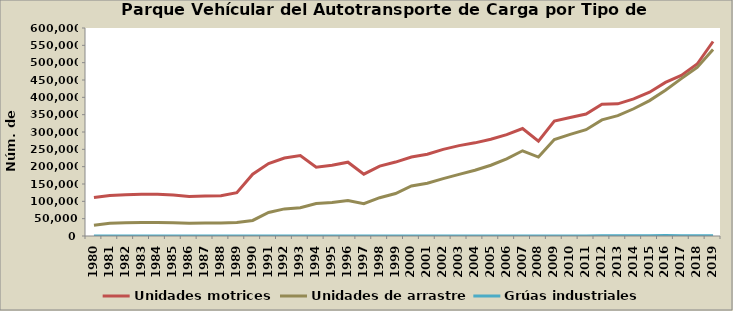
| Category | Unidades motrices | Unidades de arrastre | Grúas industriales |
|---|---|---|---|
| 1980.0 | 110810 | 31120 | 0 |
| 1981.0 | 117090 | 36760 | 0 |
| 1982.0 | 119309 | 38216 | 0 |
| 1983.0 | 120702 | 38639 | 0 |
| 1984.0 | 120702 | 38639 | 0 |
| 1985.0 | 117956 | 38317 | 0 |
| 1986.0 | 114000 | 36500 | 0 |
| 1987.0 | 115092 | 37245 | 0 |
| 1988.0 | 115897 | 37506 | 0 |
| 1989.0 | 124897 | 39113 | 0 |
| 1990.0 | 178130 | 44853 | 0 |
| 1991.0 | 209060 | 67865 | 0 |
| 1992.0 | 224913 | 78233 | 0 |
| 1993.0 | 232203 | 81307 | 0 |
| 1994.0 | 198273 | 93827 | 0 |
| 1995.0 | 204117 | 96638 | 0 |
| 1996.0 | 212909 | 102409 | 0 |
| 1997.0 | 178332 | 92999 | 0 |
| 1998.0 | 201587 | 110530 | 0 |
| 1999.0 | 213292 | 122619 | 126 |
| 2000.0 | 227847 | 144225 | 191 |
| 2001.0 | 235767 | 152341 | 212 |
| 2002.0 | 250025 | 165601 | 221 |
| 2003.0 | 260645 | 177864 | 251 |
| 2004.0 | 268725 | 189568 | 256 |
| 2005.0 | 279112 | 204186 | 266 |
| 2006.0 | 292418 | 222580 | 281 |
| 2007.0 | 310013 | 245843 | 294 |
| 2008.0 | 273455 | 227806 | 277 |
| 2009.0 | 331686 | 278133 | 329 |
| 2010.0 | 342064 | 293053 | 351 |
| 2011.0 | 351705 | 306700 | 355 |
| 2012.0 | 380342 | 334858 | 483 |
| 2013.0 | 381250 | 347112 | 684 |
| 2014.0 | 395552 | 367051 | 877 |
| 2015.0 | 414790 | 390563 | 1052 |
| 2016.0 | 443058 | 420553 | 1224 |
| 2017.0 | 463016 | 453916 | 449 |
| 2018.0 | 496057 | 486335 | 464 |
| 2019.0 | 561061 | 537813 | 497 |